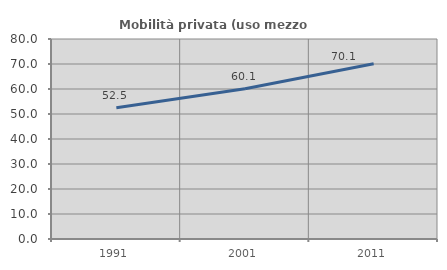
| Category | Mobilità privata (uso mezzo privato) |
|---|---|
| 1991.0 | 52.505 |
| 2001.0 | 60.078 |
| 2011.0 | 70.103 |